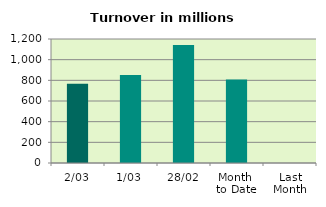
| Category | Series 0 |
|---|---|
| 2/03 | 765.784 |
| 1/03 | 851.878 |
| 28/02 | 1142.289 |
| Month 
to Date | 808.831 |
| Last
Month | 0 |